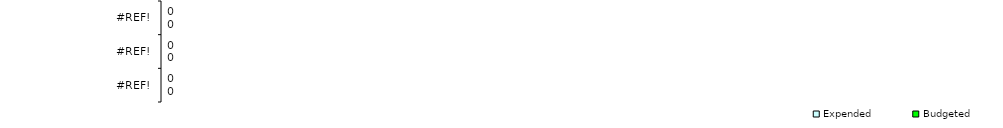
| Category | Budgeted | Expended |
|---|---|---|
| 0.0 | 0 | 0 |
| 0.0 | 0 | 0 |
| 0.0 | 0 | 0 |